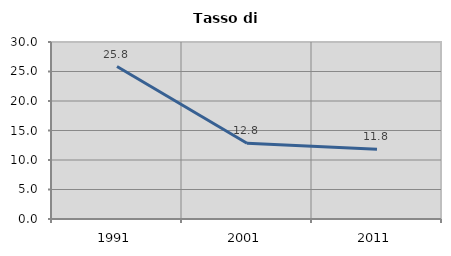
| Category | Tasso di disoccupazione   |
|---|---|
| 1991.0 | 25.844 |
| 2001.0 | 12.838 |
| 2011.0 | 11.808 |